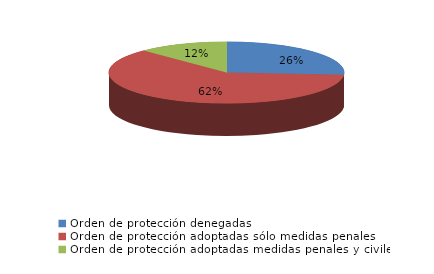
| Category | Series 0 |
|---|---|
| Orden de protección denegadas | 53 |
| Orden de protección adoptadas sólo medidas penales | 125 |
| Orden de protección adoptadas medidas penales y civiles | 25 |